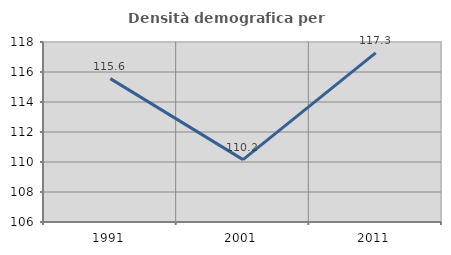
| Category | Densità demografica |
|---|---|
| 1991.0 | 115.557 |
| 2001.0 | 110.158 |
| 2011.0 | 117.28 |